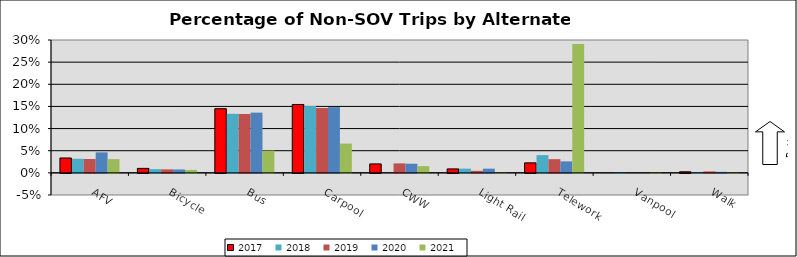
| Category | 2017 | 2018 | 2019 | 2020 | 2021 |
|---|---|---|---|---|---|
| AFV | 0.034 | 0.032 | 0.031 | 0.046 | 0.031 |
| Bicycle | 0.01 | 0.008 | 0.008 | 0.008 | 0.007 |
| Bus | 0.145 | 0.133 | 0.133 | 0.136 | 0.05 |
| Carpool | 0.154 | 0.151 | 0.147 | 0.148 | 0.066 |
| CWW | 0.02 | 0 | 0.021 | 0.021 | 0.015 |
| Light Rail | 0.009 | 0.009 | 0.005 | 0.009 | 0.001 |
| Telework | 0.023 | 0.04 | 0.031 | 0.026 | 0.291 |
| Vanpool | 0 | 0.001 | 0 | 0 | 0.001 |
| Walk | 0.002 | 0.001 | 0.003 | 0.002 | 0.001 |